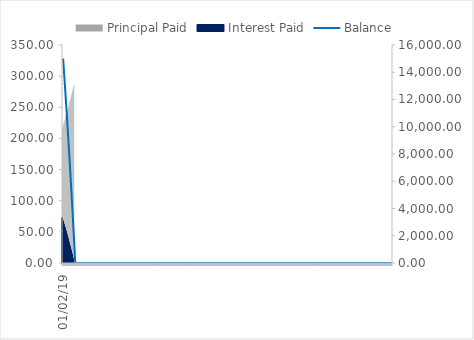
| Category | Principal Paid | Interest Paid |
|---|---|---|
| 01/02/19 | 215.871 | 73.013 |
| 01/03/19 | 216.922 | 71.962 |
| 01/04/19 | 217.978 | 70.907 |
| 01/05/19 | 219.039 | 69.846 |
| 01/06/19 | 220.105 | 68.779 |
| 01/07/19 | 221.177 | 67.708 |
| 01/08/19 | 222.253 | 66.631 |
| 01/09/19 | 223.335 | 65.55 |
| 01/10/19 | 224.422 | 64.463 |
| 01/11/19 | 225.515 | 63.37 |
| 01/12/19 | 226.612 | 62.272 |
| 01/01/20 | 227.715 | 61.169 |
| 01/02/20 | 228.824 | 60.061 |
| 01/03/20 | 229.938 | 58.947 |
| 01/04/20 | 231.057 | 57.828 |
| 01/05/20 | 232.182 | 56.703 |
| 01/06/20 | 233.312 | 55.573 |
| 01/07/20 | 234.447 | 54.437 |
| 01/08/20 | 235.588 | 53.296 |
| 01/09/20 | 236.735 | 52.15 |
| 01/10/20 | 237.888 | 50.997 |
| 01/11/20 | 239.045 | 49.839 |
| 01/12/20 | 240.209 | 48.676 |
| 01/01/21 | 241.378 | 47.506 |
| 01/02/21 | 242.553 | 46.332 |
| 01/03/21 | 243.734 | 45.151 |
| 01/04/21 | 244.92 | 43.965 |
| 01/05/21 | 246.112 | 42.772 |
| 01/06/21 | 247.31 | 41.574 |
| 01/07/21 | 248.514 | 40.371 |
| 01/08/21 | 249.724 | 39.161 |
| 01/09/21 | 250.939 | 37.945 |
| 01/10/21 | 252.161 | 36.724 |
| 01/11/21 | 253.388 | 35.497 |
| 01/12/21 | 254.622 | 34.263 |
| 01/01/22 | 255.861 | 33.024 |
| 01/02/22 | 257.106 | 31.778 |
| 01/03/22 | 258.358 | 30.527 |
| 01/04/22 | 259.615 | 29.269 |
| 01/05/22 | 260.879 | 28.006 |
| 01/06/22 | 262.149 | 26.736 |
| 01/07/22 | 263.425 | 25.46 |
| 01/08/22 | 264.707 | 24.178 |
| 01/09/22 | 265.996 | 22.889 |
| 01/10/22 | 267.29 | 21.594 |
| 01/11/22 | 268.592 | 20.293 |
| 01/12/22 | 269.899 | 18.986 |
| 01/01/23 | 271.213 | 17.672 |
| 01/02/23 | 272.533 | 16.352 |
| 01/03/23 | 273.859 | 15.025 |
| 01/04/23 | 275.192 | 13.692 |
| 01/05/23 | 276.532 | 12.353 |
| 01/06/23 | 277.878 | 11.007 |
| 01/07/23 | 279.231 | 9.654 |
| 01/08/23 | 280.59 | 8.295 |
| 01/09/23 | 281.955 | 6.929 |
| 01/10/23 | 283.328 | 5.557 |
| 01/11/23 | 284.707 | 4.178 |
| 01/12/23 | 286.093 | 2.792 |
| 01/01/24 | 287.485 | 1.399 |